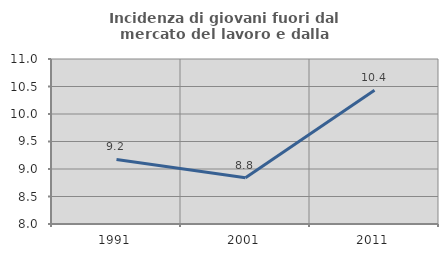
| Category | Incidenza di giovani fuori dal mercato del lavoro e dalla formazione  |
|---|---|
| 1991.0 | 9.174 |
| 2001.0 | 8.839 |
| 2011.0 | 10.434 |